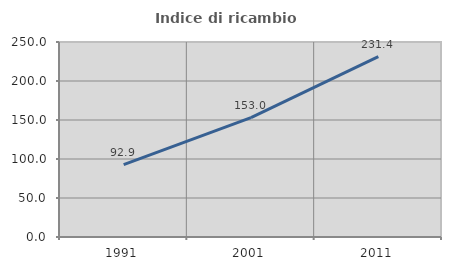
| Category | Indice di ricambio occupazionale  |
|---|---|
| 1991.0 | 92.883 |
| 2001.0 | 152.96 |
| 2011.0 | 231.373 |